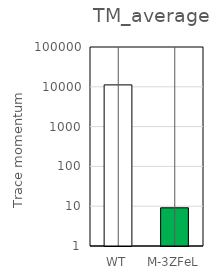
| Category | TM_average |
|---|---|
| WT | 11160.783 |
| M-3ZFeL | 9.115 |